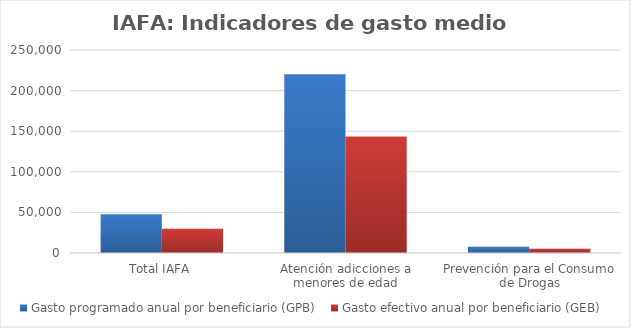
| Category | Gasto programado anual por beneficiario (GPB)  | Gasto efectivo anual por beneficiario (GEB)  |
|---|---|---|
| Total IAFA | 47670.311 | 29902.631 |
| Atención adicciones a menores de edad | 220157.297 | 143537.29 |
| Prevención para el Consumo de Drogas | 7848.267 | 5241.251 |